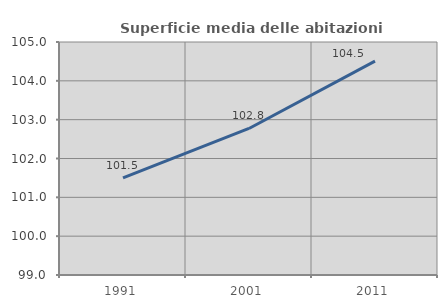
| Category | Superficie media delle abitazioni occupate |
|---|---|
| 1991.0 | 101.5 |
| 2001.0 | 102.773 |
| 2011.0 | 104.506 |